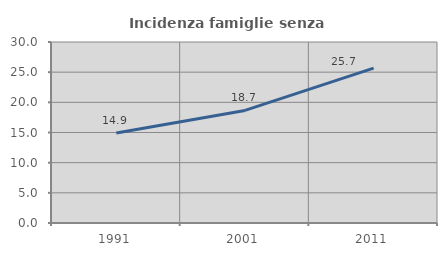
| Category | Incidenza famiglie senza nuclei |
|---|---|
| 1991.0 | 14.907 |
| 2001.0 | 18.655 |
| 2011.0 | 25.668 |